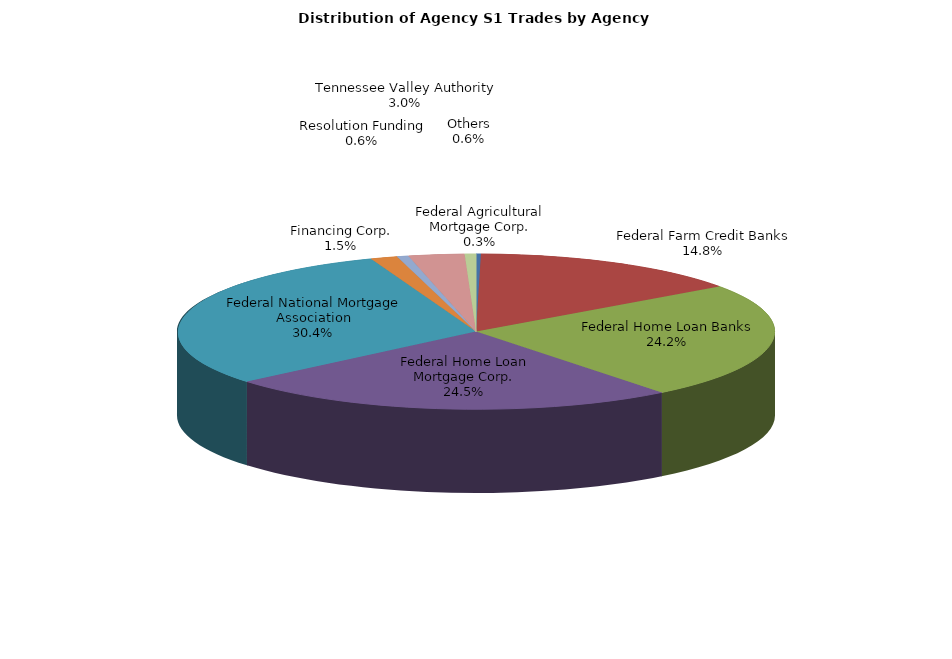
| Category | Series 0 |
|---|---|
| Federal Agricultural Mortgage Corp. | 6.571 |
| Federal Farm Credit Banks | 369.222 |
| Federal Home Loan Banks | 602.956 |
| Federal Home Loan Mortgage Corp. | 610.718 |
| Federal National Mortgage Association | 756.687 |
| Financing Corp. | 36.079 |
| Resolution Funding | 15.377 |
| Tennessee Valley Authority | 75.175 |
| Others | 15.127 |